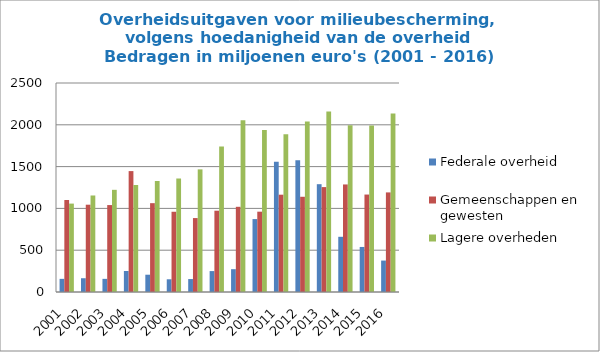
| Category | Federale overheid | Gemeenschappen en gewesten | Lagere overheden |
|---|---|---|---|
| 2001.0 | 157.2 | 1100.2 | 1057.5 |
| 2002.0 | 164.7 | 1044.2 | 1154.5 |
| 2003.0 | 157.2 | 1039.9 | 1222.2 |
| 2004.0 | 251 | 1446.2 | 1279.6 |
| 2005.0 | 206.8 | 1062.6 | 1327.9 |
| 2006.0 | 152.1 | 959.8 | 1357.7 |
| 2007.0 | 154.8 | 884.4 | 1466.9 |
| 2008.0 | 250.2 | 972.5 | 1741.5 |
| 2009.0 | 272.9 | 1019.1 | 2053.6 |
| 2010.0 | 872.3 | 960.7 | 1936.9 |
| 2011.0 | 1556.6 | 1163.9 | 1888.4 |
| 2012.0 | 1575.8 | 1139.1 | 2038.1 |
| 2013.0 | 1289.6 | 1254.8 | 2158.1 |
| 2014.0 | 660.3 | 1286.5 | 1995 |
| 2015.0 | 538.8 | 1165.7 | 1991.7 |
| 2016.0 | 376 | 1191.3 | 2135.7 |